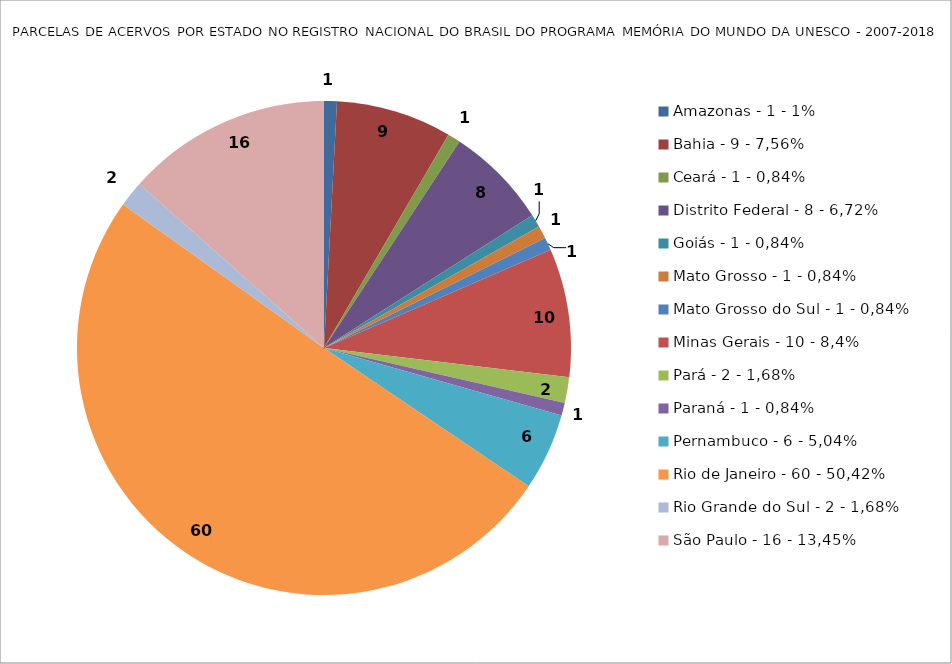
| Category | Series 0 |
|---|---|
| Amazonas - 1 - 1% | 1 |
| Bahia - 9 - 7,56% | 9 |
| Ceará - 1 - 0,84% | 1 |
| Distrito Federal - 8 - 6,72% | 8 |
| Goiás - 1 - 0,84% | 1 |
| Mato Grosso - 1 - 0,84% | 1 |
| Mato Grosso do Sul - 1 - 0,84% | 1 |
| Minas Gerais - 10 - 8,4% | 10 |
| Pará - 2 - 1,68% | 2 |
| Paraná - 1 - 0,84% | 1 |
| Pernambuco - 6 - 5,04% | 6 |
| Rio de Janeiro - 60 - 50,42% | 60 |
| Rio Grande do Sul - 2 - 1,68% | 2 |
| São Paulo - 16 - 13,45% | 16 |